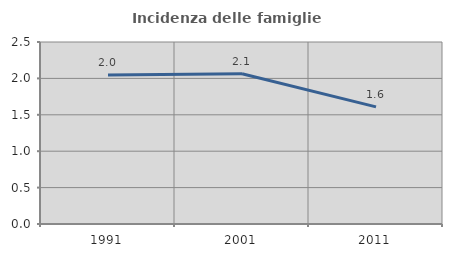
| Category | Incidenza delle famiglie numerose |
|---|---|
| 1991.0 | 2.048 |
| 2001.0 | 2.065 |
| 2011.0 | 1.609 |